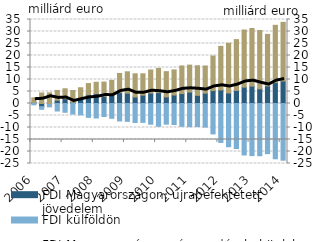
| Category | FDI Magyarországon: újrabefektetett jövedelem | FDI külföldön | FDI Magyarországon: részesedések, hitelek |
|---|---|---|---|
| 2006 | 0.422 | -0.545 | 1.917 |
| II. | -1.323 | -1.093 | 4.39 |
| III. | -0.052 | -1.355 | 4.434 |
| IV. | 1.359 | -3.127 | 4.096 |
| 2007 | 2.019 | -3.66 | 4.126 |
| II. | 0.506 | -4.385 | 4.923 |
| III. | 2.155 | -4.732 | 4.413 |
| IV. | 3.633 | -5.77 | 4.673 |
| 2008 | 4.139 | -6.036 | 4.711 |
| II. | 2.881 | -5.428 | 6.038 |
| III. | 3.392 | -6.155 | 6.25 |
| IV. | 4.528 | -7.284 | 7.969 |
| 2009 | 4.302 | -7.443 | 8.909 |
| II. | 2.705 | -7.934 | 9.666 |
| III. | 3.484 | -7.866 | 8.89 |
| IV. | 4.336 | -8.632 | 9.637 |
| 2010 | 4.532 | -9.489 | 10.09 |
| II. | 2.743 | -8.602 | 10.527 |
| III. | 3.54 | -8.768 | 10.442 |
| IV. | 4.15 | -9.519 | 11.498 |
| 2011 | 4.756 | -9.654 | 11.227 |
| II. | 3.4 | -9.606 | 12.33 |
| III. | 4.306 | -9.847 | 11.325 |
| IV. | 5.369 | -12.66 | 14.41 |
| 2012 | 5.639 | -16.229 | 18.172 |
| II. | 4.39 | -18.008 | 20.699 |
| III. | 5.459 | -18.745 | 21.164 |
| IV. | 6.82 | -21.46 | 23.81 |
| 2013 | 7.233 | -21.716 | 24.013 |
| II. | 6.112 | -21.77 | 24.319 |
| III. | 7.316 | -20.898 | 21.492 |
| IV. | 8.697 | -23.028 | 23.88 |
| 2014 | 9.366 | -23.624 | 24.443 |